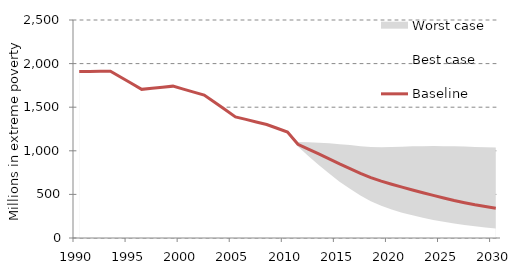
| Category | Baseline |
|---|---|
| 1990.0 | 1908.45 |
| 1991.0 | 1909.737 |
| 1992.0 | 1911.023 |
| 1993.0 | 1912.31 |
| 1994.0 | 1843.047 |
| 1995.0 | 1773.783 |
| 1996.0 | 1704.52 |
| 1997.0 | 1716.847 |
| 1998.0 | 1729.173 |
| 1999.0 | 1741.5 |
| 2000.0 | 1707.343 |
| 2001.0 | 1673.187 |
| 2002.0 | 1639.03 |
| 2003.0 | 1555.753 |
| 2004.0 | 1472.477 |
| 2005.0 | 1389.2 |
| 2006.0 | 1360.11 |
| 2007.0 | 1331.02 |
| 2008.0 | 1301.93 |
| 2009.0 | 1258.455 |
| 2010.0 | 1214.98 |
| 2011.0 | 1074.251 |
| 2012.0 | 1018.977 |
| 2013.0 | 963.877 |
| 2014.0 | 907.976 |
| 2015.0 | 850.378 |
| 2016.0 | 796.549 |
| 2017.0 | 741.84 |
| 2018.0 | 692.465 |
| 2019.0 | 651.741 |
| 2020.0 | 616.183 |
| 2021.0 | 582.795 |
| 2022.0 | 550.946 |
| 2023.0 | 519.76 |
| 2024.0 | 489.19 |
| 2025.0 | 459.031 |
| 2026.0 | 429.694 |
| 2027.0 | 404.346 |
| 2028.0 | 380.873 |
| 2029.0 | 360.284 |
| 2030.0 | 341.712 |